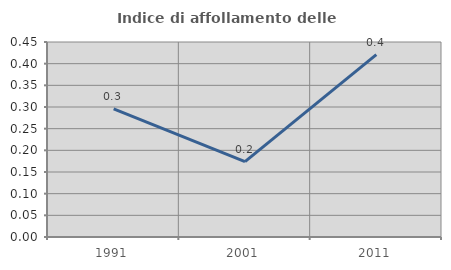
| Category | Indice di affollamento delle abitazioni  |
|---|---|
| 1991.0 | 0.296 |
| 2001.0 | 0.174 |
| 2011.0 | 0.421 |